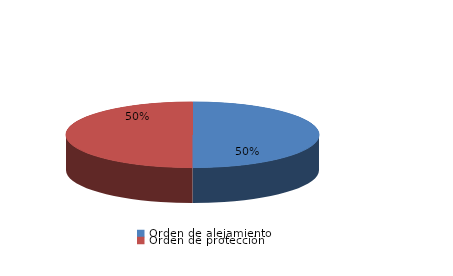
| Category | Series 0 |
|---|---|
| Orden de alejamiento | 14 |
| Orden de protección | 14 |